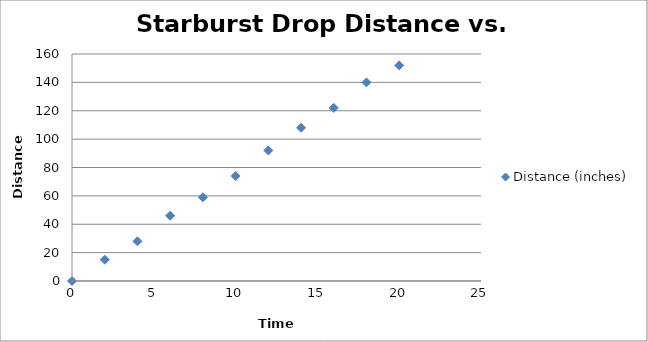
| Category | Distance (inches) |
|---|---|
| 0.0 | 0 |
| 2.0 | 15 |
| 4.0 | 28 |
| 6.0 | 46 |
| 8.0 | 59 |
| 10.0 | 74 |
| 12.0 | 92 |
| 14.0 | 108 |
| 16.0 | 122 |
| 18.0 | 140 |
| 20.0 | 152 |